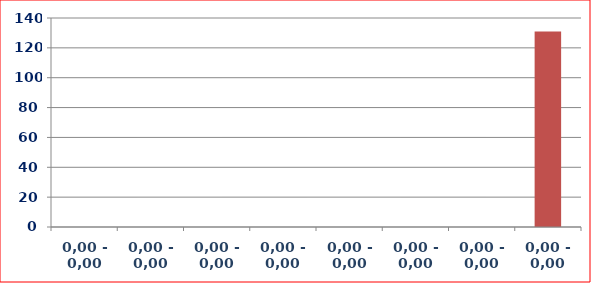
| Category | Series 1 |
|---|---|
| 0,00 - 0,00 | 0 |
| 0,00 - 0,00 | 0 |
| 0,00 - 0,00 | 0 |
| 0,00 - 0,00 | 0 |
| 0,00 - 0,00 | 0 |
| 0,00 - 0,00 | 0 |
| 0,00 - 0,00 | 0 |
| 0,00 - 0,00 | 131 |